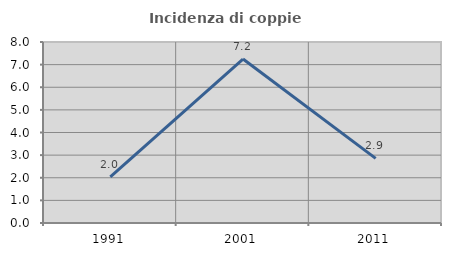
| Category | Incidenza di coppie miste |
|---|---|
| 1991.0 | 2.041 |
| 2001.0 | 7.246 |
| 2011.0 | 2.857 |